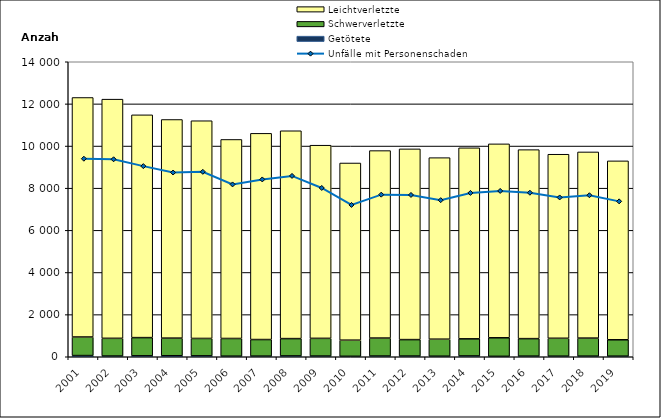
| Category | Getötete | Schwerverletzte | Leichtverletzte |
|---|---|---|---|
| 2001.0 | 56 | 882 | 11366 |
| 2002.0 | 34 | 841 | 11350 |
| 2003.0 | 44 | 864 | 10573 |
| 2004.0 | 48 | 836 | 10376 |
| 2005.0 | 43 | 826 | 10332 |
| 2006.0 | 28 | 839 | 9446 |
| 2007.0 | 30 | 787 | 9786 |
| 2008.0 | 40 | 821 | 9864 |
| 2009.0 | 33 | 840 | 9167 |
| 2010.0 | 22 | 765 | 8408 |
| 2011.0 | 34 | 853 | 8897 |
| 2012.0 | 33 | 781 | 9051 |
| 2013.0 | 26 | 808 | 8615 |
| 2014.0 | 38 | 812 | 9066 |
| 2015.0 | 20 | 880 | 9203 |
| 2016.0 | 29 | 831 | 8969 |
| 2017.0 | 28 | 849 | 8734 |
| 2018.0 | 29 | 856 | 8835 |
| 2019.0 | 28 | 778 | 8490 |